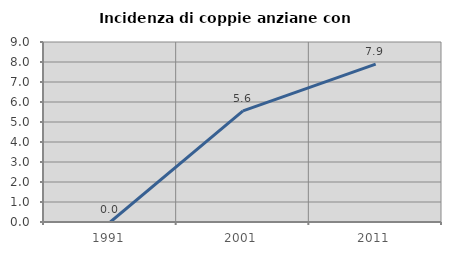
| Category | Incidenza di coppie anziane con figli |
|---|---|
| 1991.0 | 0 |
| 2001.0 | 5.556 |
| 2011.0 | 7.895 |